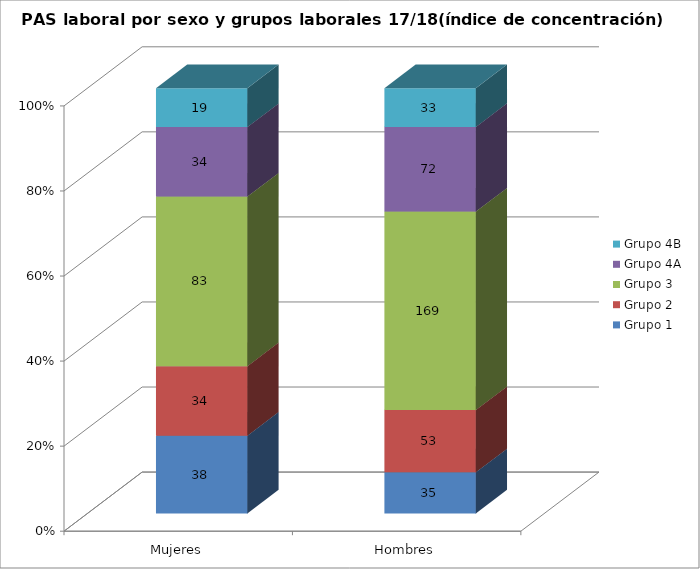
| Category | Grupo 1 | Grupo 2 | Grupo 3 | Grupo 4A | Grupo 4B |
|---|---|---|---|---|---|
| Mujeres | 38 | 34 | 83 | 34 | 19 |
| Hombres | 35 | 53 | 169 | 72 | 33 |